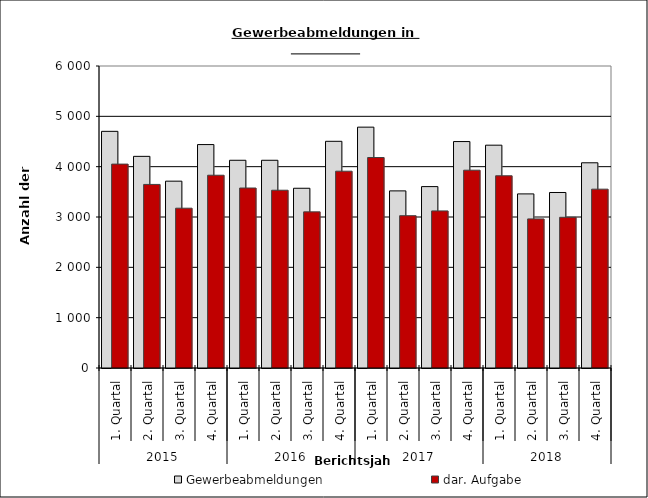
| Category | Gewerbeabmeldungen | dar. Aufgabe |
|---|---|---|
| 0 | 4702 | 4051 |
| 1 | 4205 | 3647 |
| 2 | 3712 | 3175 |
| 3 | 4439 | 3830 |
| 4 | 4127 | 3576 |
| 5 | 4127 | 3532 |
| 6 | 3571 | 3102 |
| 7 | 4504 | 3910 |
| 8 | 4785 | 4182 |
| 9 | 3519 | 3026 |
| 10 | 3604 | 3121 |
| 11 | 4499 | 3930 |
| 12 | 4427 | 3819 |
| 13 | 3459 | 2962 |
| 14 | 3487 | 2994 |
| 15 | 4077 | 3553 |